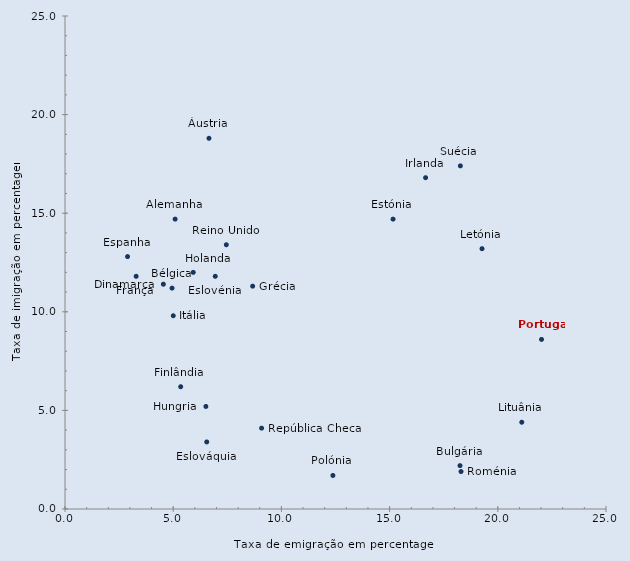
| Category | Series 0 |
|---|---|
| 5.088679 | 14.7 |
| 6.653955 | 18.8 |
| 4.947438 | 11.2 |
| 18.2537 | 2.2 |
| 4.54546 | 11.4 |
| 6.549946 | 3.4 |
| 6.943275 | 11.8 |
| 2.889851 | 12.8 |
| 15.15964 | 14.7 |
| 5.345941 | 6.2 |
| 3.288524 | 11.8 |
| 8.671733 | 11.3 |
| 5.926053 | 12 |
| 6.510313 | 5.2 |
| 16.66284 | 16.8 |
| 5.002638 | 9.8 |
| 19.2711 | 13.2 |
| 21.10732 | 4.4 |
| 12.38015 | 1.7 |
| 22.02057 | 8.6 |
| 7.454013 | 13.4 |
| 9.084351 | 4.1 |
| 18.3 | 1.9 |
| 18.27022 | 17.4 |